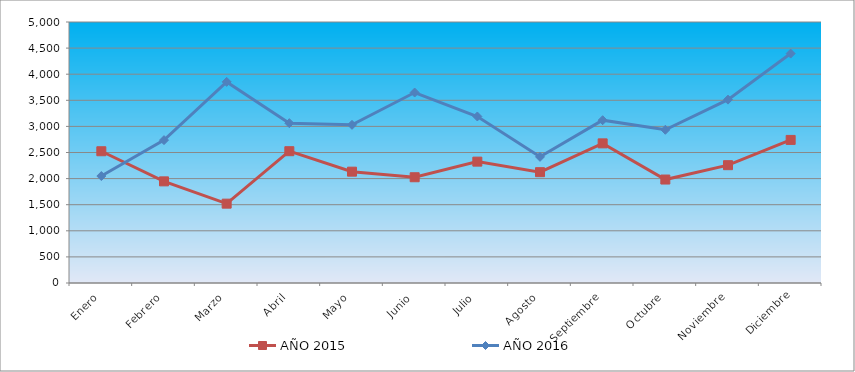
| Category | AÑO 2015 | AÑO 2016 |
|---|---|---|
| Enero | 2524 | 2049 |
| Febrero | 1947 | 2737 |
| Marzo | 1520 | 3853 |
| Abril | 2525 | 3062 |
| Mayo | 2133 | 3030 |
| Junio | 2026 | 3649 |
| Julio | 2325 | 3190 |
| Agosto | 2123 | 2417 |
| Septiembre | 2675 | 3119 |
| Octubre | 1982 | 2935 |
| Noviembre | 2257 | 3513 |
| Diciembre | 2741 | 4395 |